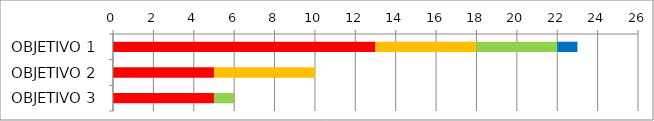
| Category | Series 1 | Series 2 | Series 3 | Series 4 | Series 5 |
|---|---|---|---|---|---|
| OBJETIVO 1 | 0 | 13 | 5 | 4 | 1 |
| OBJETIVO 2 | 0 | 5 | 5 | 0 | 0 |
| OBJETIVO 3 | 0 | 5 | 0 | 1 | 0 |